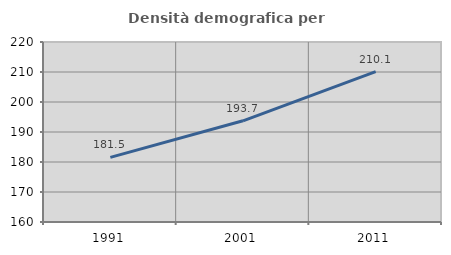
| Category | Densità demografica |
|---|---|
| 1991.0 | 181.532 |
| 2001.0 | 193.738 |
| 2011.0 | 210.142 |